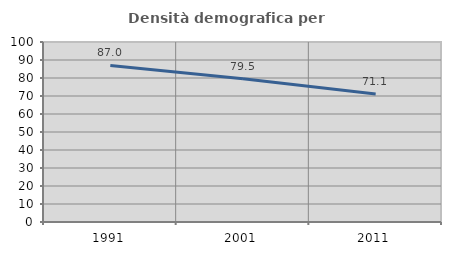
| Category | Densità demografica |
|---|---|
| 1991.0 | 86.972 |
| 2001.0 | 79.545 |
| 2011.0 | 71.074 |